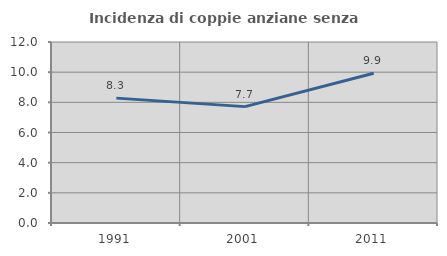
| Category | Incidenza di coppie anziane senza figli  |
|---|---|
| 1991.0 | 8.279 |
| 2001.0 | 7.716 |
| 2011.0 | 9.929 |